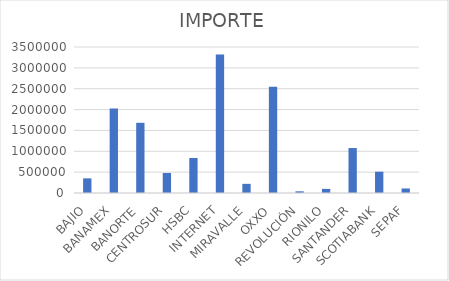
| Category | IMPORTE |
|---|---|
| BAJIO | 351015.74 |
| BANAMEX | 2025342.29 |
| BANORTE | 1682834.86 |
| CENTROSUR | 480078 |
| HSBC | 840044.28 |
| INTERNET | 3318260.68 |
| MIRAVALLE | 219320 |
| OXXO | 2546929.19 |
| REVOLUCIÓN | 40231 |
| RIONILO | 98598 |
| SANTANDER | 1077889.27 |
| SCOTIABANK | 511062.62 |
| SEPAF | 108571.62 |